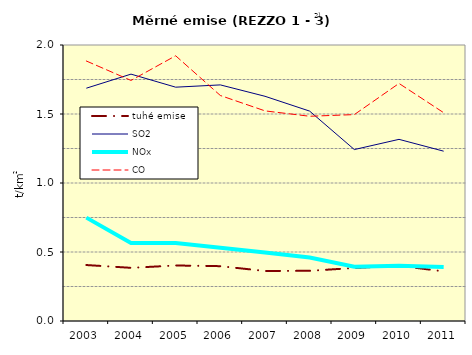
| Category | tuhé emise | SO2 | NOx | CO |
|---|---|---|---|---|
| 2003.0 | 0.406 | 1.687 | 0.749 | 1.884 |
| 2004.0 | 0.385 | 1.789 | 0.565 | 1.743 |
| 2005.0 | 0.402 | 1.694 | 0.565 | 1.922 |
| 2006.0 | 0.397 | 1.711 | 0.531 | 1.634 |
| 2007.0 | 0.362 | 1.628 | 0.496 | 1.523 |
| 2008.0 | 0.364 | 1.521 | 0.46 | 1.484 |
| 2009.0 | 0.384 | 1.242 | 0.394 | 1.496 |
| 2010.0 | 0.401 | 1.316 | 0.401 | 1.722 |
| 2011.0 | 0.36 | 1.231 | 0.392 | 1.509 |